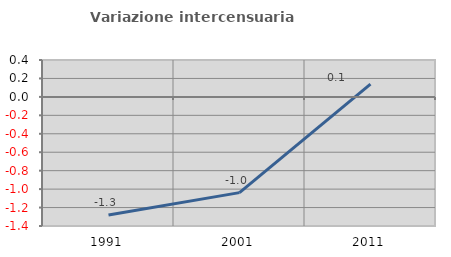
| Category | Variazione intercensuaria annua |
|---|---|
| 1991.0 | -1.28 |
| 2001.0 | -1.038 |
| 2011.0 | 0.138 |